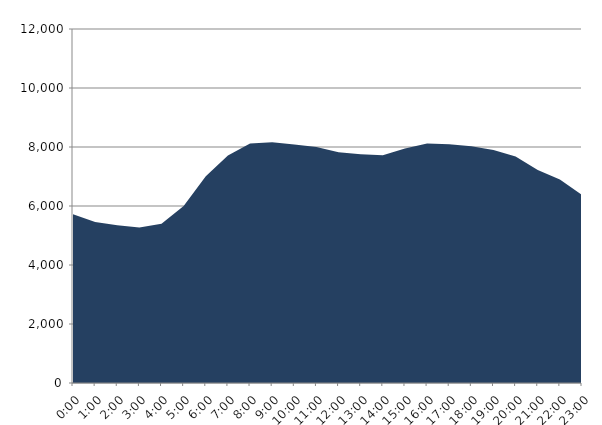
| Category | Series 0 | Series 1 |
|---|---|---|
| 2023-08-16 |  | 5717.635 |
| 2023-08-16 01:00:00 |  | 5459.49 |
| 2023-08-16 02:00:00 |  | 5351.486 |
| 2023-08-16 03:00:00 |  | 5270.569 |
| 2023-08-16 04:00:00 |  | 5399.933 |
| 2023-08-16 05:00:00 |  | 6001.699 |
| 2023-08-16 06:00:00 |  | 7012.086 |
| 2023-08-16 07:00:00 |  | 7713.111 |
| 2023-08-16 08:00:00 |  | 8120.217 |
| 2023-08-16 09:00:00 |  | 8162.494 |
| 2023-08-16 10:00:00 |  | 8082.287 |
| 2023-08-16 11:00:00 |  | 7997.528 |
| 2023-08-16 12:00:00 |  | 7822.32 |
| 2023-08-16 13:00:00 |  | 7755.34 |
| 2023-08-16 14:00:00 |  | 7716.657 |
| 2023-08-16 15:00:00 |  | 7951.065 |
| 2023-08-16 16:00:00 |  | 8119.685 |
| 2023-08-16 17:00:00 |  | 8094.285 |
| 2023-08-16 18:00:00 |  | 8028.93 |
| 2023-08-16 19:00:00 |  | 7895.954 |
| 2023-08-16 20:00:00 |  | 7681.029 |
| 2023-08-16 21:00:00 |  | 7223.804 |
| 2023-08-16 22:00:00 |  | 6897.991 |
| 2023-08-16 23:00:00 |  | 6371.84 |